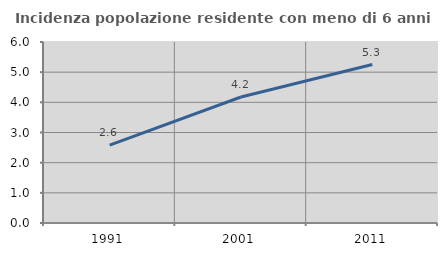
| Category | Incidenza popolazione residente con meno di 6 anni |
|---|---|
| 1991.0 | 2.582 |
| 2001.0 | 4.176 |
| 2011.0 | 5.252 |